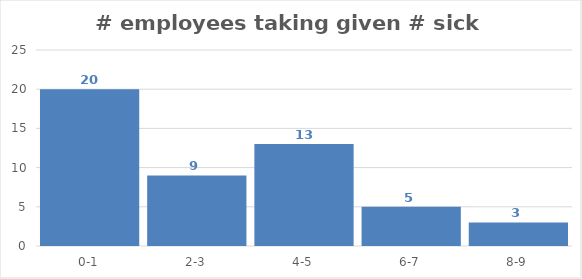
| Category | freq |
|---|---|
| 0-1 | 20 |
| 2-3 | 9 |
| 4-5 | 13 |
| 6-7 | 5 |
| 8-9 | 3 |